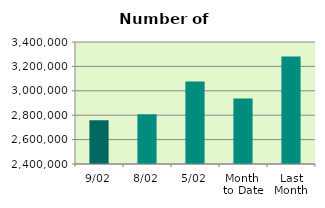
| Category | Series 0 |
|---|---|
| 9/02 | 2758538 |
| 8/02 | 2807212 |
| 5/02 | 3076344 |
| Month 
to Date | 2937061.143 |
| Last
Month | 3281385.4 |